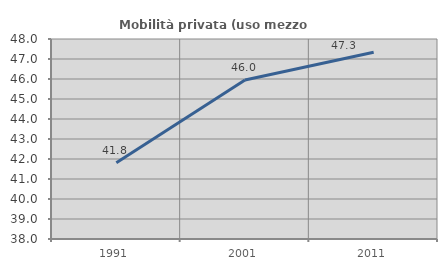
| Category | Mobilità privata (uso mezzo privato) |
|---|---|
| 1991.0 | 41.809 |
| 2001.0 | 45.951 |
| 2011.0 | 47.335 |